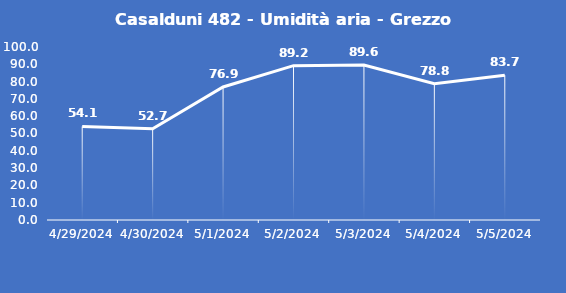
| Category | Casalduni 482 - Umidità aria - Grezzo (%) |
|---|---|
| 4/29/24 | 54.1 |
| 4/30/24 | 52.7 |
| 5/1/24 | 76.9 |
| 5/2/24 | 89.2 |
| 5/3/24 | 89.6 |
| 5/4/24 | 78.8 |
| 5/5/24 | 83.7 |